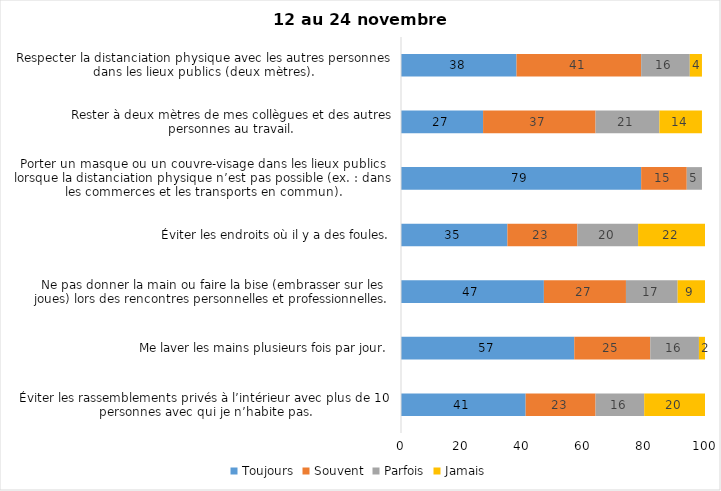
| Category | Toujours | Souvent | Parfois | Jamais |
|---|---|---|---|---|
| Éviter les rassemblements privés à l’intérieur avec plus de 10 personnes avec qui je n’habite pas. | 41 | 23 | 16 | 20 |
| Me laver les mains plusieurs fois par jour. | 57 | 25 | 16 | 2 |
| Ne pas donner la main ou faire la bise (embrasser sur les joues) lors des rencontres personnelles et professionnelles. | 47 | 27 | 17 | 9 |
| Éviter les endroits où il y a des foules. | 35 | 23 | 20 | 22 |
| Porter un masque ou un couvre-visage dans les lieux publics lorsque la distanciation physique n’est pas possible (ex. : dans les commerces et les transports en commun). | 79 | 15 | 5 | 0 |
| Rester à deux mètres de mes collègues et des autres personnes au travail. | 27 | 37 | 21 | 14 |
| Respecter la distanciation physique avec les autres personnes dans les lieux publics (deux mètres). | 38 | 41 | 16 | 4 |